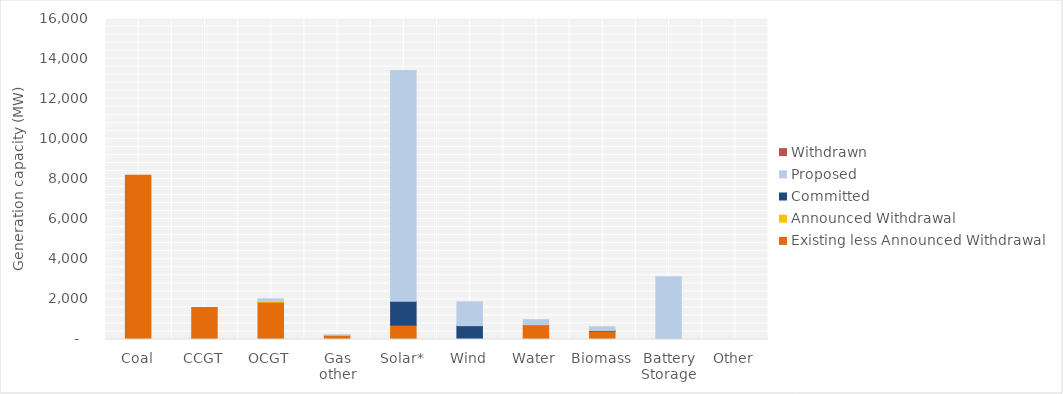
| Category | Existing less Announced Withdrawal | Announced Withdrawal | Committed | Proposed | Withdrawn |
|---|---|---|---|---|---|
| Coal | 8186 | 0 | 0 | 0 | 0 |
| CCGT | 1595.5 | 0 | 0 | 0 | 0 |
| OCGT | 1860.5 | 34 | 0 | 132 | 0 |
| Gas other | 208.37 | 0 | 0 | 15.205 | 0 |
| Solar* | 716.426 | 0 | 1194.95 | 11501.627 | 0 |
| Wind | 12 | 0 | 676.7 | 1188.4 | 0 |
| Water | 738.2 | 0 | 0 | 250 | 0 |
| Biomass | 419.19 | 0 | 24 | 189.6 | 0 |
| Battery Storage | 0 | 0 | 2 | 3120 | 0 |
| Other | 1 | 0 | 0 | 0 | 0 |